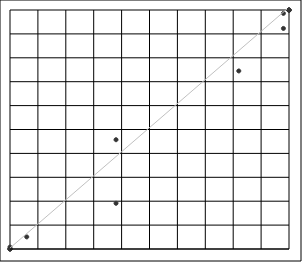
| Category | Series 0 |
|---|---|
| 0.0 | 0 |
| 0.0 | 0 |
| 0.0 | 0.004 |
| 0.0 | 0.076 |
| 0.0 | 0.808 |
| 6.0 | 5.059 |
| 38.0 | 19.128 |
| 38.0 | 45.73 |
| 82.0 | 74.496 |
| 98.0 | 92.287 |
| 98.0 | 98.576 |
| 100.0 | 99.844 |
| 100.0 | 99.99 |
| 100.0 | 100 |
| 100.0 | 100 |
| 100.0 | 100 |